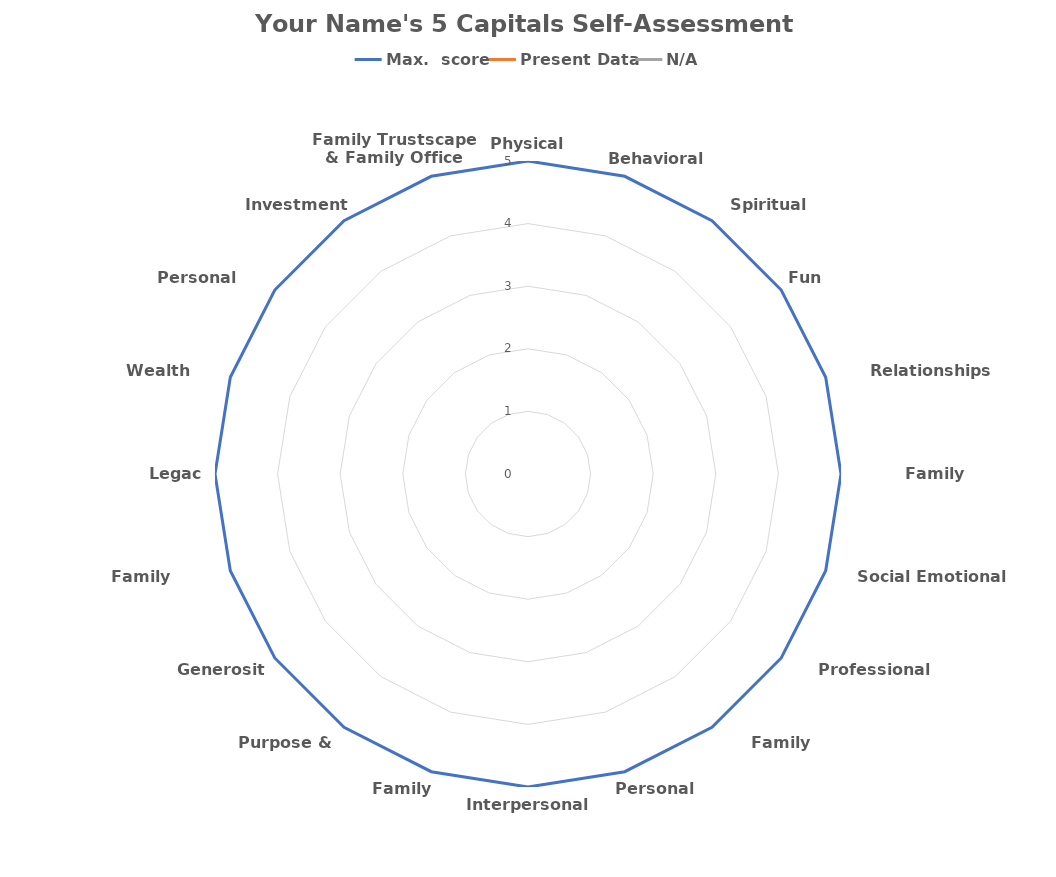
| Category | Max.  score | Present Data | N/A |
|---|---|---|---|
| Physical Health | 5 | 0 | 0 |
| Behavioral Health | 5 | 0 | 0 |
| Spiritual Health | 5 | 0 | 0 |
| Fun | 5 | 0 | 0 |
| Relationships Generally | 5 | 0 | 0 |
| Family Relationships | 5 | 0 | 0 |
| Social Emotional Health | 5 | 0 | 0 |
| Professional Hygiene | 5 | 0 | 0 |
| Family Governance | 5 | 0 | 0 |
| Personal Growth | 5 | 0 | 0 |
| Interpersonal Skills | 5 | 0 | 0 |
| Family Learning | 5 | 0 | 0 |
| Purpose & Work | 5 | 0 | 0 |
| Generosity | 5 | 0 | 0 |
| Family Foundations | 5 | 0 | 0 |
| Legacy | 5 | 0 | 0 |
| Wealth Identity | 5 | 0 | 0 |
| Personal Finance | 5 | 0 | 0 |
| Investments | 5 | 0 | 0 |
| Family Trustscape & Family Office | 5 | 0 | 0 |